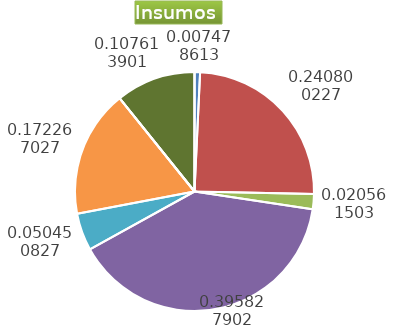
| Category | Series 0 |
|---|---|
| Control arvenses | 261217 |
| Control fitosanitario | 8585442 |
| Cosecha y beneficio | 718183.2 |
| Fertilización | 13825689 |
| Instalación | 1762173.499 |
| Otros | 6017035 |
| Podas | 0 |
| Riego | 0 |
| Transporte | 3758796 |
| Tutorado | 0 |